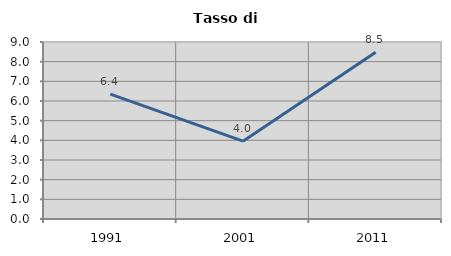
| Category | Tasso di disoccupazione   |
|---|---|
| 1991.0 | 6.352 |
| 2001.0 | 3.958 |
| 2011.0 | 8.483 |